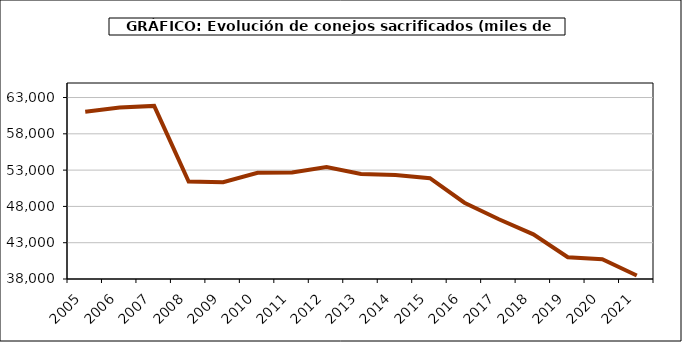
| Category | Peso canal |
|---|---|
| 2005.0 | 61048.849 |
| 2006.0 | 61617.92 |
| 2007.0 | 61847.888 |
| 2008.0 | 51435.256 |
| 2009.0 | 51329.996 |
| 2010.0 | 52633.291 |
| 2011.0 | 52667.903 |
| 2012.0 | 53411.014 |
| 2013.0 | 52470.38 |
| 2014.0 | 52326.841 |
| 2015.0 | 51880.278 |
| 2016.0 | 48506.567 |
| 2017.0 | 46233.799 |
| 2018.0 | 44155.273 |
| 2019.0 | 41005.916 |
| 2020.0 | 40723.049 |
| 2021.0 | 38477.669 |